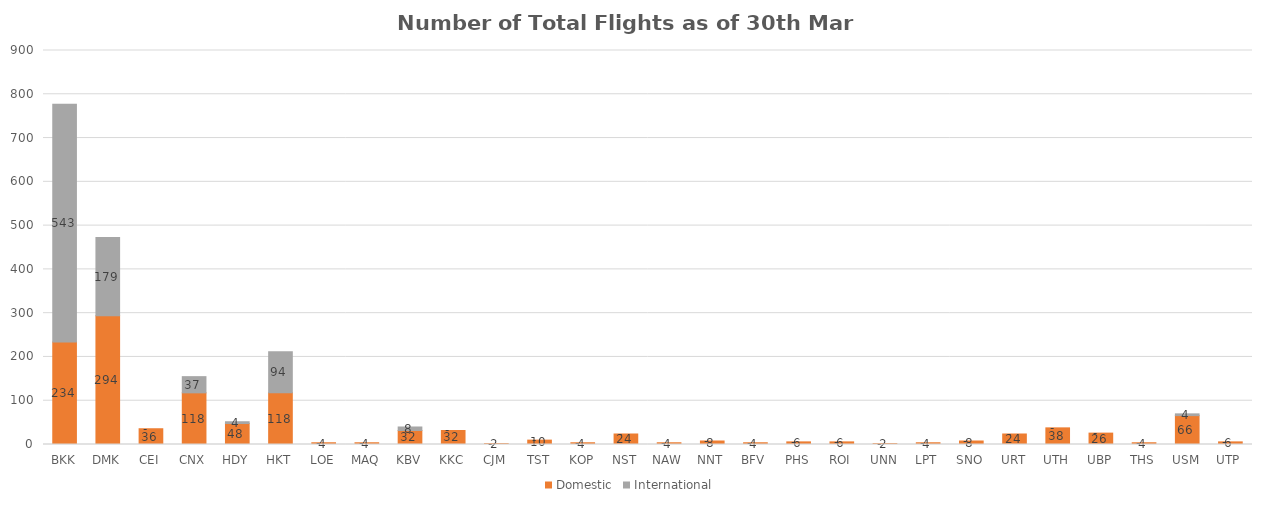
| Category | Domestic | International |
|---|---|---|
| BKK | 234 | 543 |
| DMK | 294 | 179 |
| CEI | 36 | 0 |
| CNX | 118 | 37 |
| HDY | 48 | 4 |
| HKT | 118 | 94 |
| LOE | 4 | 0 |
| MAQ | 4 | 0 |
| KBV | 32 | 8 |
| KKC | 32 | 0 |
| CJM | 2 | 0 |
| TST | 10 | 0 |
| KOP | 4 | 0 |
| NST | 24 | 0 |
| NAW | 4 | 0 |
| NNT | 8 | 0 |
| BFV | 4 | 0 |
| PHS | 6 | 0 |
| ROI | 6 | 0 |
| UNN | 2 | 0 |
| LPT | 4 | 0 |
| SNO | 8 | 0 |
| URT | 24 | 0 |
| UTH | 38 | 0 |
| UBP | 26 | 0 |
| THS | 4 | 0 |
| USM | 66 | 4 |
| UTP | 6 | 0 |